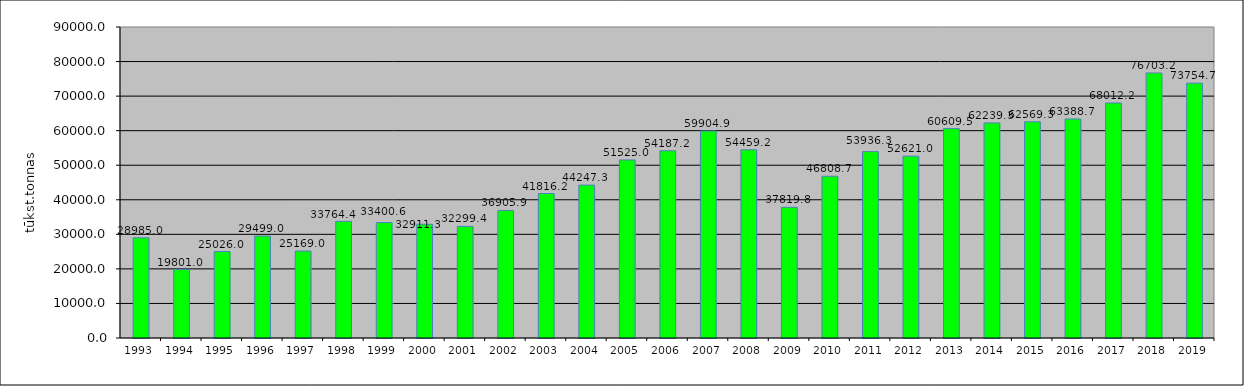
| Category | Series 0 |
|---|---|
| 1993.0 | 28985 |
| 1994.0 | 19801 |
| 1995.0 | 25026 |
| 1996.0 | 29499 |
| 1997.0 | 25169 |
| 1998.0 | 33764.4 |
| 1999.0 | 33400.6 |
| 2000.0 | 32911.3 |
| 2001.0 | 32299.4 |
| 2002.0 | 36905.9 |
| 2003.0 | 41816.2 |
| 2004.0 | 44247.3 |
| 2005.0 | 51525 |
| 2006.0 | 54187.2 |
| 2007.0 | 59904.9 |
| 2008.0 | 54459.2 |
| 2009.0 | 37819.8 |
| 2010.0 | 46808.7 |
| 2011.0 | 53936.3 |
| 2012.0 | 52621 |
| 2013.0 | 60609.5 |
| 2014.0 | 62239.3 |
| 2015.0 | 62569.3 |
| 2016.0 | 63388.7 |
| 2017.0 | 68012.2 |
| 2018.0 | 76703.2 |
| 2019.0 | 73754.7 |